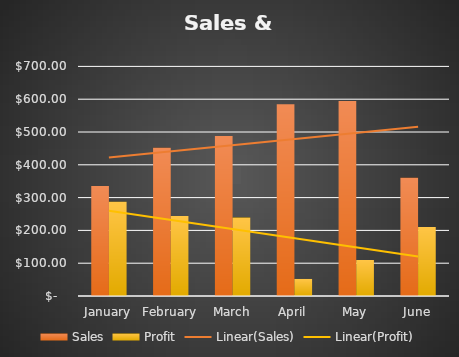
| Category | Sales | Profit |
|---|---|---|
| January | 335.48 | 287.37 |
| February | 451.61 | 243.99 |
| March | 487.47 | 238.97 |
| April | 584.5 | 51.96 |
| May | 594.88 | 109.71 |
| June | 360.77 | 210.29 |